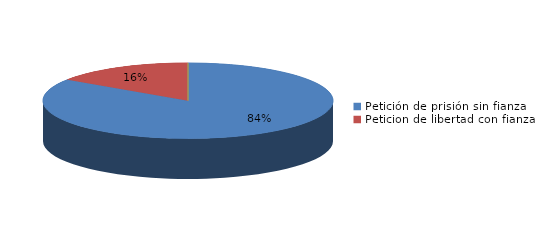
| Category | Series 0 |
|---|---|
| Petición de prisión sin fianza | 27 |
| Peticion de libertad con fianza | 5 |
| Petición de libertad | 0 |